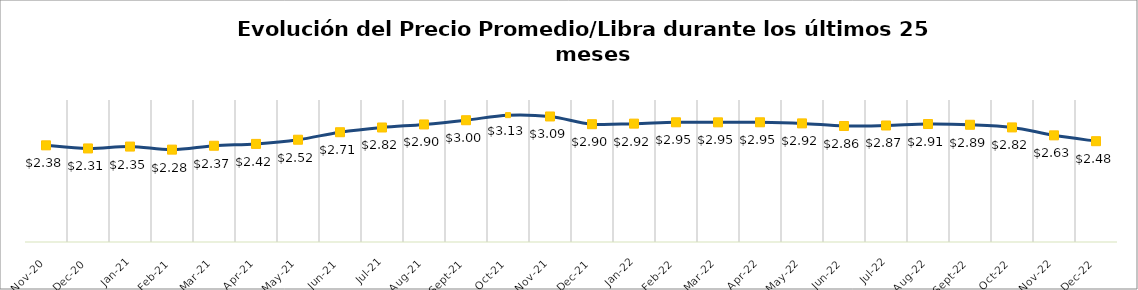
| Category | Series 1 |
|---|---|
| 2020-11-01 | 2.383 |
| 2020-12-01 | 2.306 |
| 2021-01-01 | 2.352 |
| 2021-02-01 | 2.277 |
| 2021-03-01 | 2.373 |
| 2021-04-01 | 2.418 |
| 2021-05-01 | 2.521 |
| 2021-06-01 | 2.706 |
| 2021-07-01 | 2.822 |
| 2021-08-01 | 2.897 |
| 2021-09-01 | 3.002 |
| 2021-10-01 | 3.127 |
| 2021-11-01 | 3.094 |
| 2021-12-01 | 2.904 |
| 2022-01-01 | 2.918 |
| 2022-02-01 | 2.951 |
| 2022-03-01 | 2.949 |
| 2022-04-01 | 2.951 |
| 2022-05-01 | 2.924 |
| 2022-06-01 | 2.86 |
| 2022-07-01 | 2.872 |
| 2022-08-01 | 2.907 |
| 2022-09-01 | 2.89 |
| 2022-10-01 | 2.824 |
| 2022-11-01 | 2.629 |
| 2022-12-01 | 2.485 |